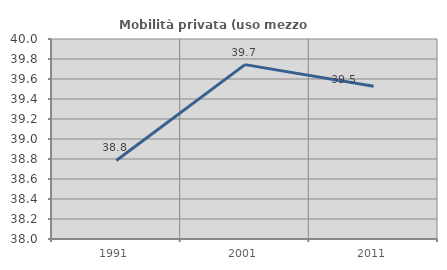
| Category | Mobilità privata (uso mezzo privato) |
|---|---|
| 1991.0 | 38.786 |
| 2001.0 | 39.744 |
| 2011.0 | 39.527 |